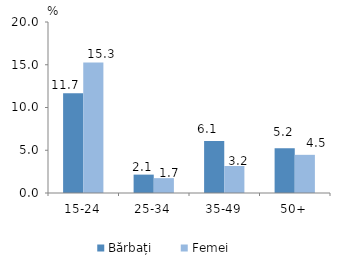
| Category | Bărbați | Femei |
|---|---|---|
| 15-24 | 11.658 | 15.265 |
| 25-34 | 2.15 | 1.737 |
| 35-49 | 6.075 | 3.157 |
| 50+ | 5.247 | 4.464 |